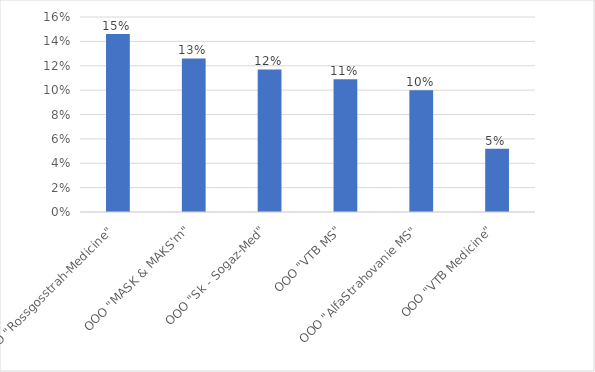
| Category | Series 0 |
|---|---|
| OOO "Rossgosstrah-Medicine" | 0.146 |
| OOO "MASK & MAKS'm" | 0.126 |
| OOO "Sk - Sogaz-Med" | 0.117 |
| OOO "VTB MS" | 0.109 |
| OOO "AlfaStrahovanie MS" | 0.1 |
| OOO "VTB Medicine" | 0.052 |